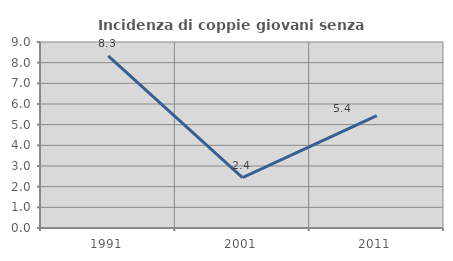
| Category | Incidenza di coppie giovani senza figli |
|---|---|
| 1991.0 | 8.333 |
| 2001.0 | 2.439 |
| 2011.0 | 5.442 |